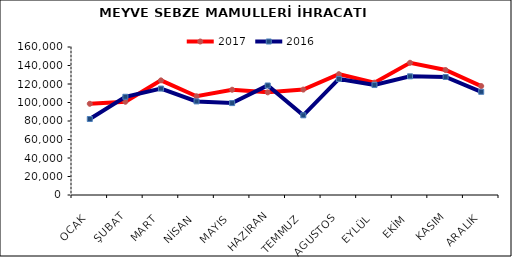
| Category | 2017 | 2016 |
|---|---|---|
| OCAK | 98614.027 | 82138.198 |
| ŞUBAT | 100791.018 | 106167.37 |
| MART | 123925.278 | 115040.832 |
| NİSAN | 106739.392 | 101190.365 |
| MAYIS | 113795.827 | 99357.541 |
| HAZİRAN | 110971.996 | 118406.696 |
| TEMMUZ | 113951.38 | 86164.128 |
| AGUSTOS | 130624.32 | 125436.717 |
| EYLÜL | 121452.178 | 118881.667 |
| EKİM | 142959.42 | 128309.019 |
| KASIM | 135104.284 | 127562.482 |
| ARALIK | 117768.538 | 111567.238 |